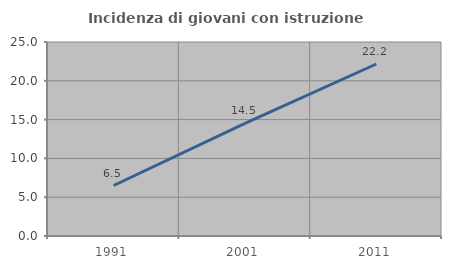
| Category | Incidenza di giovani con istruzione universitaria |
|---|---|
| 1991.0 | 6.506 |
| 2001.0 | 14.519 |
| 2011.0 | 22.165 |